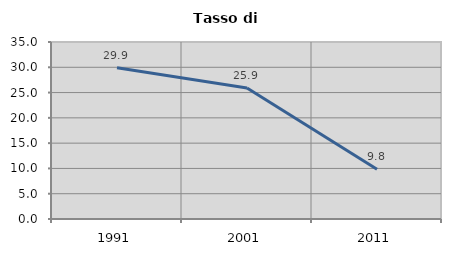
| Category | Tasso di disoccupazione   |
|---|---|
| 1991.0 | 29.888 |
| 2001.0 | 25.904 |
| 2011.0 | 9.818 |